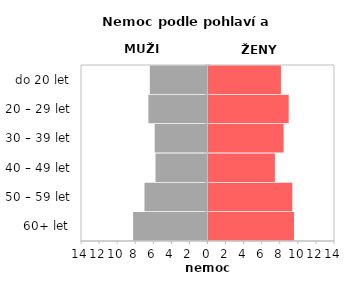
| Category | Nemoc |
|---|---|
| 60+ let | 9.46 |
| 50 – 59 let | 9.273 |
| 40 – 49 let | 7.351 |
| 30 – 39 let | 8.314 |
| 20 – 29 let | 8.876 |
| do 20 let | 8.017 |